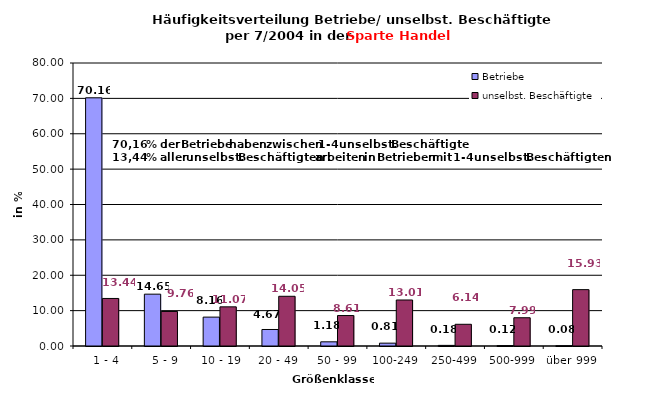
| Category | Betriebe | unselbst. Beschäftigte |
|---|---|---|
|   1 - 4 | 70.156 | 13.437 |
|   5 - 9 | 14.653 | 9.763 |
|  10 - 19 | 8.163 | 11.072 |
| 20 - 49 | 4.666 | 14.052 |
| 50 - 99 | 1.181 | 8.61 |
| 100-249 | 0.807 | 13.007 |
| 250-499 | 0.175 | 6.137 |
| 500-999 | 0.117 | 7.987 |
| über 999 | 0.082 | 15.934 |